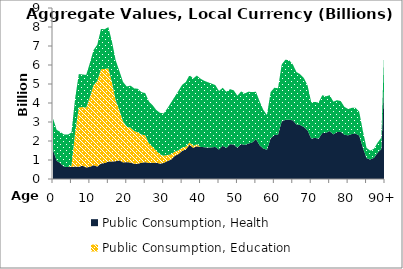
| Category | Public Consumption, Health | Public Consumption, Education | Public Consumption, Other than health and education |
|---|---|---|---|
| 0 | 1529.656 | 0 | 1649.598 |
|  | 965.554 | 0 | 1619.838 |
| 2 | 831.822 | 0 | 1644.577 |
| 3 | 643.544 | 0 | 1694.361 |
| 4 | 634.186 | 0 | 1702.11 |
| 5 | 638.994 | 64.919 | 1737.313 |
| 6 | 653.995 | 1800.454 | 1789.948 |
| 7 | 643.986 | 3123.145 | 1757.119 |
| 8 | 698.602 | 3090.203 | 1712.383 |
| 9 | 609.93 | 3146.211 | 1720.921 |
| 10 | 635.745 | 3677.471 | 1792.504 |
| 11 | 730.956 | 4209.902 | 1849.16 |
| 12 | 652.223 | 4504.596 | 1908.205 |
| 13 | 815.81 | 4964.266 | 2112.955 |
| 14 | 839.099 | 4950.759 | 2094.925 |
| 15 | 917.414 | 4911.562 | 2163.272 |
| 16 | 923.205 | 4164.674 | 2126.144 |
| 17 | 936.31 | 3201.554 | 2102.917 |
| 18 | 982.426 | 2637.205 | 2061.01 |
| 19 | 872.915 | 2162.707 | 2069.31 |
| 20 | 889.314 | 1856.573 | 2122.554 |
| 21 | 865.345 | 1837.885 | 2212.172 |
| 22 | 805.806 | 1722.762 | 2239.866 |
| 23 | 805.641 | 1644.32 | 2299.536 |
| 24 | 854.353 | 1482.748 | 2229.548 |
| 25 | 888.389 | 1412.746 | 2223.845 |
| 26 | 840.506 | 1033.804 | 2209.77 |
| 27 | 858.635 | 832.161 | 2193.029 |
| 28 | 854.731 | 626.397 | 2149.691 |
| 29 | 810.697 | 492.498 | 2183.017 |
| 30 | 844.981 | 378.831 | 2225.624 |
| 31 | 944.182 | 317.177 | 2455.019 |
| 32 | 1022.17 | 272.361 | 2728.573 |
| 33 | 1215.801 | 222.731 | 2894.474 |
| 34 | 1311.065 | 198.133 | 3125.02 |
| 35 | 1479.654 | 172.272 | 3304.332 |
| 36 | 1552.721 | 147.009 | 3402.977 |
| 37 | 1805.951 | 125.311 | 3536.618 |
| 38 | 1641.699 | 106.674 | 3541.663 |
| 39 | 1723.137 | 106.674 | 3612.454 |
| 40 | 1684.284 | 0 | 3593.889 |
| 41 | 1676.143 | 0 | 3492.67 |
| 42 | 1648.895 | 0 | 3441.775 |
| 43 | 1664.486 | 0 | 3357.179 |
| 44 | 1688.41 | 0 | 3253.706 |
| 45 | 1553.144 | 0 | 3080.745 |
| 46 | 1751.888 | 0 | 3046.972 |
| 47 | 1634.38 | 0 | 2955.662 |
| 48 | 1828.962 | 0 | 2900.523 |
| 49 | 1813.682 | 0 | 2848.852 |
| 50 | 1643.724 | 0 | 2740.186 |
| 51 | 1840.593 | 0 | 2770.05 |
| 52 | 1790.849 | 0 | 2707.719 |
| 53 | 1866.263 | 0 | 2733.032 |
| 54 | 1918.834 | 0 | 2652.969 |
| 55 | 2109.736 | 0 | 2484.427 |
| 56 | 1779.024 | 0 | 2315.674 |
| 57 | 1600.36 | 0 | 2039.427 |
| 58 | 1543.592 | 0 | 1826.23 |
| 59 | 2141.656 | 0 | 2434.68 |
| 60 | 2309.883 | 0 | 2491.688 |
| 61 | 2332.463 | 0 | 2444.367 |
| 62 | 3031.115 | 0 | 3001.19 |
| 63 | 3110.52 | 0 | 3168.682 |
| 64 | 3122.182 | 0 | 3132.319 |
| 65 | 3087.712 | 0 | 2948.154 |
| 66 | 2875.492 | 0 | 2751.671 |
| 67 | 2841.93 | 0 | 2676.516 |
| 68 | 2740.709 | 0 | 2571.007 |
| 69 | 2563.45 | 0 | 2372.964 |
| 70 | 2124.667 | 0 | 1908.601 |
| 71 | 2166.179 | 0 | 1890.918 |
| 72 | 2122.359 | 0 | 1896.395 |
| 73 | 2414.02 | 0 | 1996.012 |
| 74 | 2429.664 | 0 | 1920.631 |
| 75 | 2521.655 | 0 | 1889.656 |
| 76 | 2348.193 | 0 | 1724.529 |
| 77 | 2469.232 | 0 | 1677.347 |
| 78 | 2483.153 | 0 | 1619.353 |
| 79 | 2329.383 | 0 | 1464.818 |
| 80 | 2297.539 | 0 | 1387.511 |
| 81 | 2365.041 | 0 | 1378.208 |
| 82 | 2390.907 | 0 | 1358.961 |
| 83 | 2293.724 | 0 | 1254.507 |
| 84 | 1651.175 | 0 | 880.638 |
| 85 | 1102.55 | 0 | 536.58 |
| 86 | 1026.419 | 0 | 468.487 |
| 87 | 1117.068 | 0 | 471.807 |
| 88 | 1377.266 | 0 | 541.607 |
| 89 | 1570.516 | 0 | 602.729 |
| 90+ | 5893.776 | 0 | 2161.432 |